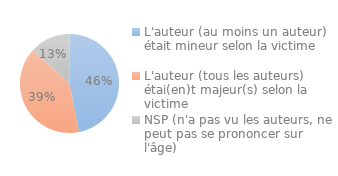
| Category | Series 0 |
|---|---|
| L'auteur (au moins un auteur) était mineur selon la victime | 0.46 |
| L'auteur (tous les auteurs) étai(en)t majeur(s) selon la victime | 0.39 |
| NSP (n'a pas vu les auteurs, ne peut pas se prononcer sur l'âge) | 0.13 |